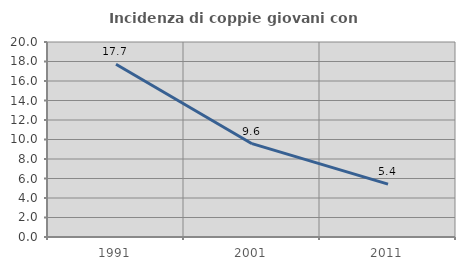
| Category | Incidenza di coppie giovani con figli |
|---|---|
| 1991.0 | 17.724 |
| 2001.0 | 9.572 |
| 2011.0 | 5.427 |